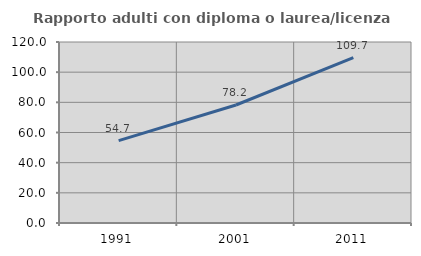
| Category | Rapporto adulti con diploma o laurea/licenza media  |
|---|---|
| 1991.0 | 54.651 |
| 2001.0 | 78.241 |
| 2011.0 | 109.665 |